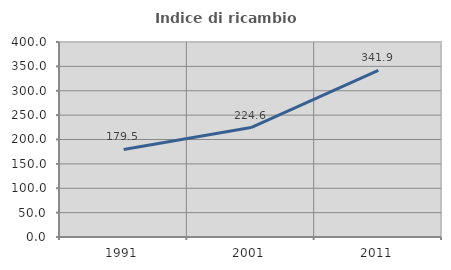
| Category | Indice di ricambio occupazionale  |
|---|---|
| 1991.0 | 179.545 |
| 2001.0 | 224.561 |
| 2011.0 | 341.86 |